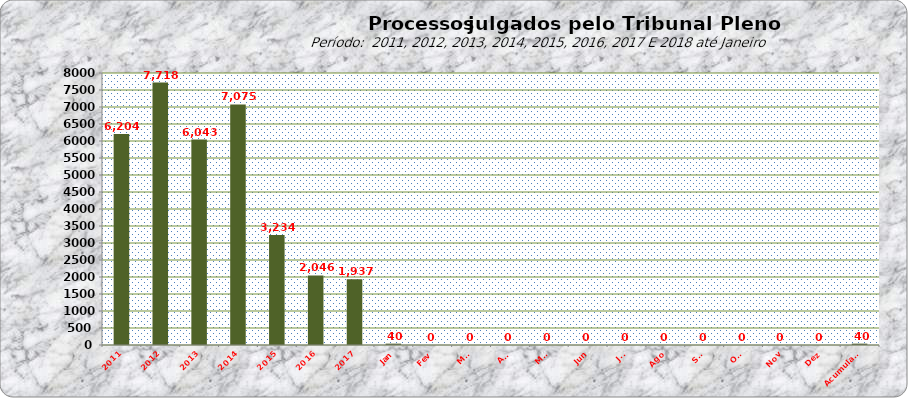
| Category | Series 0 |
|---|---|
| 2011 | 6204 |
| 2012 | 7718 |
| 2013 | 6043 |
| 2014 | 7075 |
| 2015 | 3234 |
| 2016 | 2046 |
| 2017 | 1937 |
| Jan | 40 |
| Fev | 0 |
| Mar | 0 |
| Abr | 0 |
| Mai | 0 |
| Jun | 0 |
| Jul | 0 |
| Ago | 0 |
| Set | 0 |
| Out | 0 |
| Nov | 0 |
| Dez | 0 |
| Acumulado | 40 |